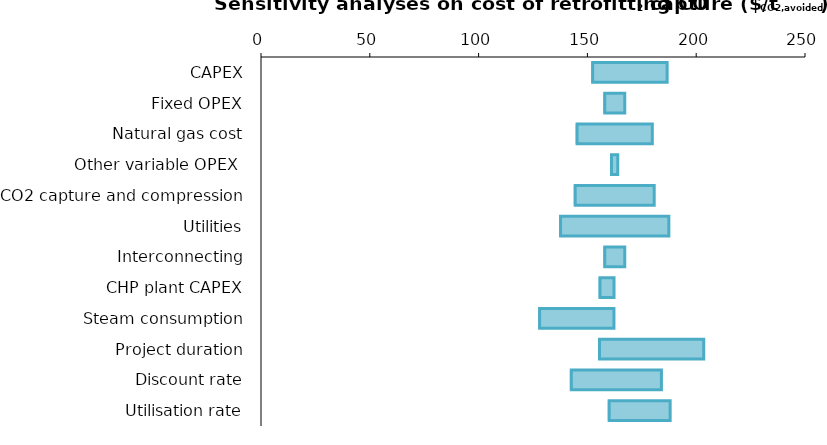
| Category | Minimum value | Increase of the parameter |
|---|---|---|
| CAPEX | 151.719 | 34.921 |
| Fixed OPEX | 157.243 | 9.905 |
| Natural gas cost | 144.565 | 35.26 |
| Other variable OPEX  | 160.431 | 3.529 |
| CO2 capture and compression | 143.695 | 37 |
| Utilities | 136.97 | 50.451 |
| Interconnecting | 157.262 | 9.866 |
| CHP plant CAPEX | 155.075 | 7.12 |
| Steam consumption | 127.348 | 34.848 |
| Project duration | 154.875 | 48.587 |
| Discount rate | 141.913 | 42.103 |
| Utilisation rate | 159.325 | 28.702 |